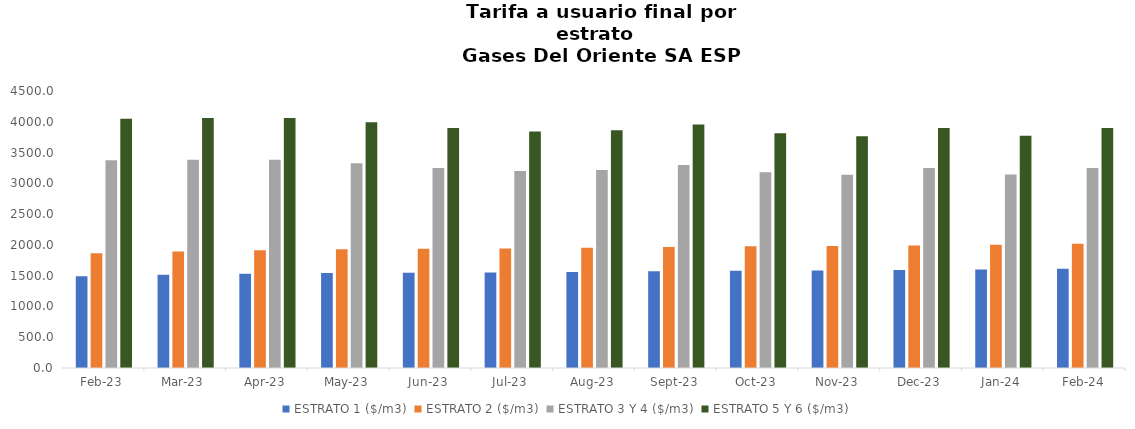
| Category | ESTRATO 1 ($/m3) | ESTRATO 2 ($/m3) | ESTRATO 3 Y 4 ($/m3) | ESTRATO 5 Y 6 ($/m3) |
|---|---|---|---|---|
| 2023-02-01 | 1488.96 | 1863.54 | 3374.22 | 4049.064 |
| 2023-03-01 | 1513.69 | 1894.49 | 3383.42 | 4060.104 |
| 2023-04-01 | 1529.59 | 1914.39 | 3383.42 | 4060.104 |
| 2023-05-01 | 1541.54 | 1929.36 | 3326.59 | 3991.908 |
| 2023-06-01 | 1548.28 | 1937.78 | 3250.2 | 3900.24 |
| 2023-07-01 | 1551.99 | 1942.43 | 3200.63 | 3840.756 |
| 2023-08-01 | 1560.7 | 1953.33 | 3217.02 | 3860.424 |
| 2023-09-01 | 1571.61 | 1966.99 | 3297.13 | 3956.556 |
| 2023-10-01 | 1579.97 | 1977.45 | 3179.1 | 3814.92 |
| 2023-11-01 | 1583.91 | 1982.39 | 3137.6 | 3765.12 |
| 2023-12-01 | 1591.49 | 1991.6 | 3248.56 | 3898.272 |
| 2024-01-01 | 1598.77 | 2000.98 | 3143.99 | 3772.788 |
| 2024-02-01 | 1613.32 | 2019.31 | 3248.06 | 3897.672 |